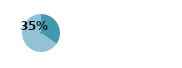
| Category | Series 0 |
|---|---|
| 0 | 0.348 |
| 1 | 0.652 |